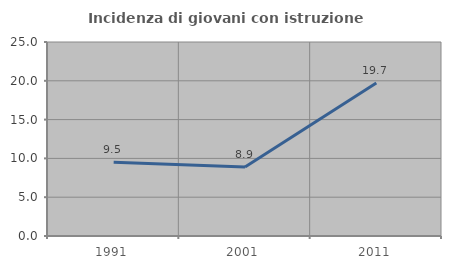
| Category | Incidenza di giovani con istruzione universitaria |
|---|---|
| 1991.0 | 9.497 |
| 2001.0 | 8.889 |
| 2011.0 | 19.713 |